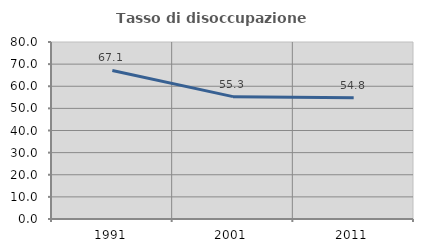
| Category | Tasso di disoccupazione giovanile  |
|---|---|
| 1991.0 | 67.141 |
| 2001.0 | 55.301 |
| 2011.0 | 54.75 |